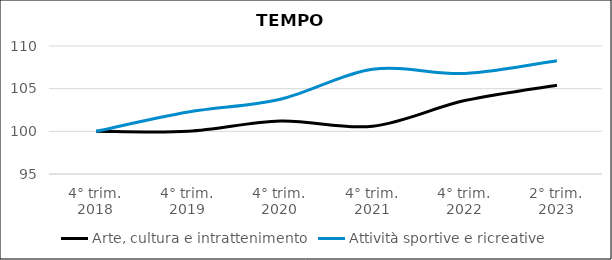
| Category | Arte, cultura e intrattenimento | Attività sportive e ricreative |
|---|---|---|
| 4° trim.
2018 | 100 | 100 |
| 4° trim.
2019 | 100 | 102.258 |
| 4° trim.
2020 | 101.201 | 103.764 |
| 4° trim.
2021 | 100.601 | 107.277 |
| 4° trim.
2022 | 103.604 | 106.775 |
| 2° trim.
2023 | 105.405 | 108.281 |